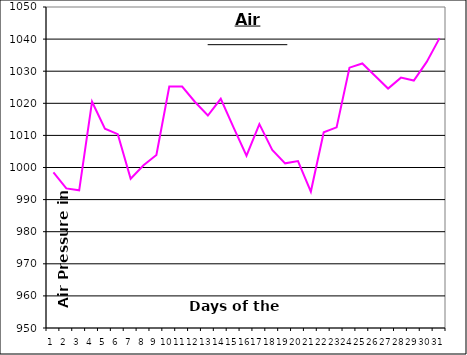
| Category | Series 0 |
|---|---|
| 0 | 998.5 |
| 1 | 993.5 |
| 2 | 992.9 |
| 3 | 1020.5 |
| 4 | 1012.1 |
| 5 | 1010.4 |
| 6 | 996.5 |
| 7 | 1000.7 |
| 8 | 1003.9 |
| 9 | 1025.2 |
| 10 | 1025.2 |
| 11 | 1020.4 |
| 12 | 1016.2 |
| 13 | 1021.4 |
| 14 | 1012.4 |
| 15 | 1003.7 |
| 16 | 1013.5 |
| 17 | 1005.5 |
| 18 | 1001.3 |
| 19 | 1002 |
| 20 | 992.5 |
| 21 | 1011 |
| 22 | 1012.5 |
| 23 | 1031.1 |
| 24 | 1032.4 |
| 25 | 1028.5 |
| 26 | 1024.6 |
| 27 | 1028 |
| 28 | 1027.1 |
| 29 | 1032.9 |
| 30 | 1040.3 |